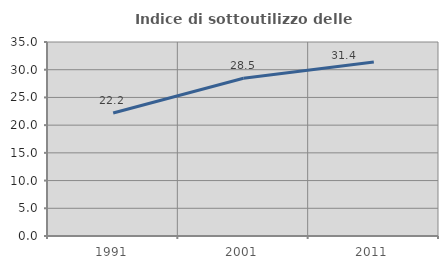
| Category | Indice di sottoutilizzo delle abitazioni  |
|---|---|
| 1991.0 | 22.199 |
| 2001.0 | 28.465 |
| 2011.0 | 31.387 |